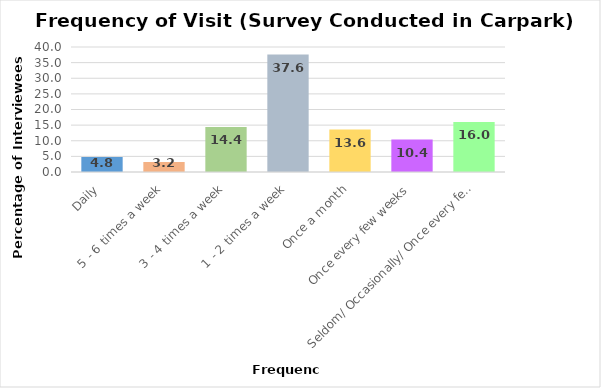
| Category | Series 0 |
|---|---|
| Daily | 4.8 |
| 5 - 6 times a week | 3.2 |
| 3 - 4 times a week | 14.4 |
| 1 - 2 times a week | 37.6 |
| Once a month | 13.6 |
| Once every few weeks | 10.4 |
| Seldom/ Occasionally/ Once every few mths | 16 |